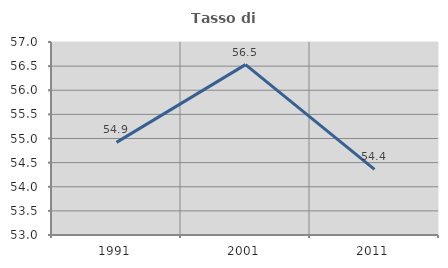
| Category | Tasso di occupazione   |
|---|---|
| 1991.0 | 54.92 |
| 2001.0 | 56.531 |
| 2011.0 | 54.36 |